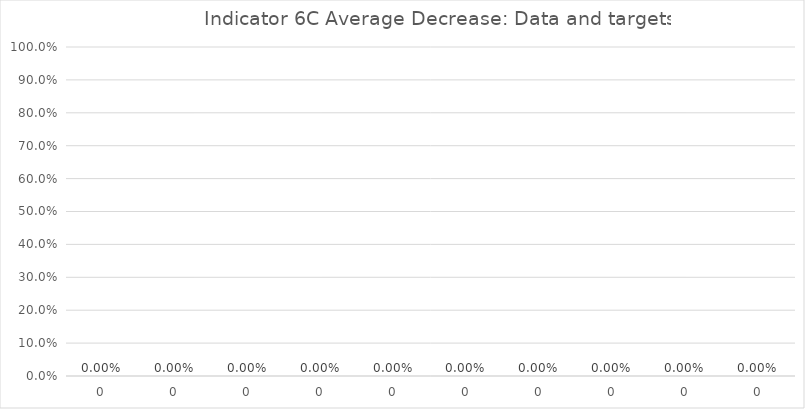
| Category | Indicator 6C data and targets |
|---|---|
| 0.0 | 0 |
| 0.0 | 0 |
| 0.0 | 0 |
| 0.0 | 0 |
| 0.0 | 0 |
| 0.0 | 0 |
| 0.0 | 0 |
| 0.0 | 0 |
| 0.0 | 0 |
| 0.0 | 0 |